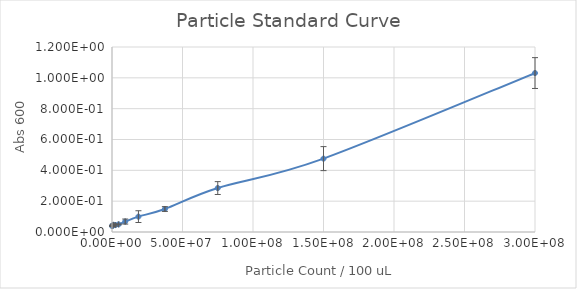
| Category | Series 0 |
|---|---|
| 300000000.0 | 1.031 |
| 150000000.0 | 0.476 |
| 75000000.0 | 0.285 |
| 37500000.0 | 0.149 |
| 18750000.0 | 0.1 |
| 9375000.0 | 0.068 |
| 4687500.0 | 0.05 |
| 2343750.0 | 0.045 |
| 1171875.0 | 0.046 |
| 585937.5 | 0.044 |
| 292968.75 | 0.039 |
| 0.0 | 0.039 |